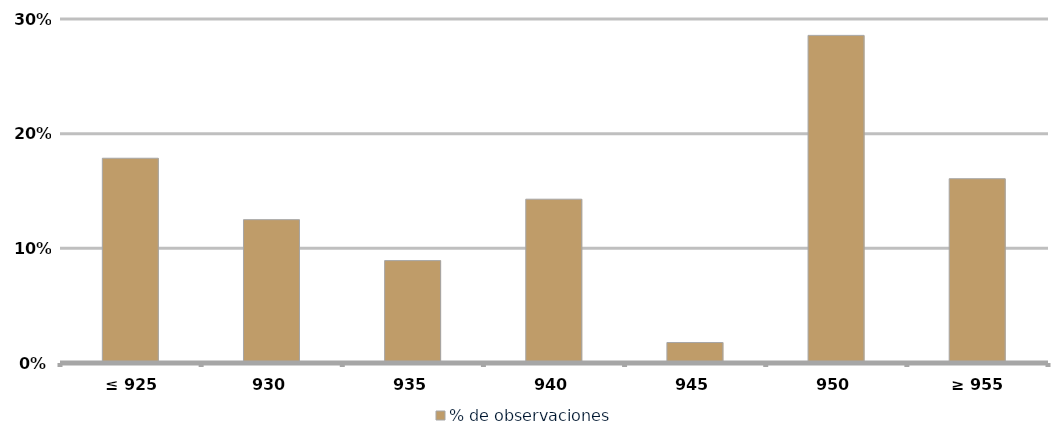
| Category | % de observaciones  |
|---|---|
|  ≤ 925  | 0.179 |
|  930  | 0.125 |
|  935  | 0.089 |
|  940  | 0.143 |
|  945  | 0.018 |
| 950 | 0.286 |
|  ≥ 955  | 0.161 |